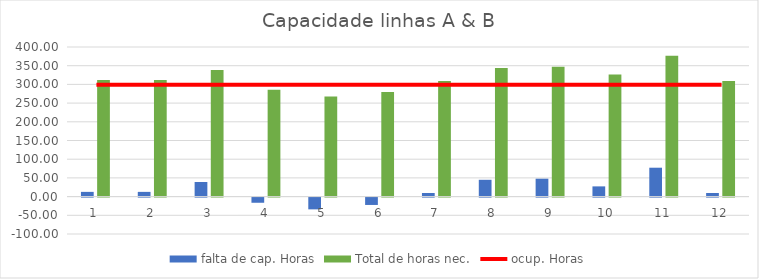
| Category | falta de cap. Horas | Total de horas nec. |
|---|---|---|
| 1.0 | 12.629 | 311.829 |
| 2.0 | 12.629 | 311.829 |
| 3.0 | 39.063 | 338.263 |
| 4.0 | -13.804 | 285.396 |
| 5.0 | -31.427 | 267.773 |
| 6.0 | -19.678 | 279.522 |
| 7.0 | 9.692 | 308.892 |
| 8.0 | 44.937 | 344.137 |
| 9.0 | 47.874 | 347.074 |
| 10.0 | 27.315 | 326.515 |
| 11.0 | 77.245 | 376.445 |
| 12.0 | 9.692 | 308.892 |